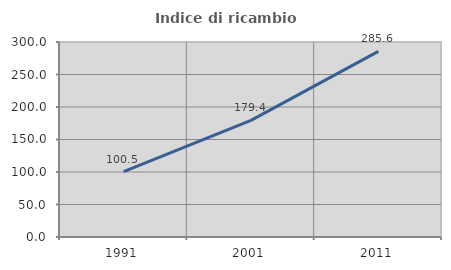
| Category | Indice di ricambio occupazionale  |
|---|---|
| 1991.0 | 100.529 |
| 2001.0 | 179.365 |
| 2011.0 | 285.595 |